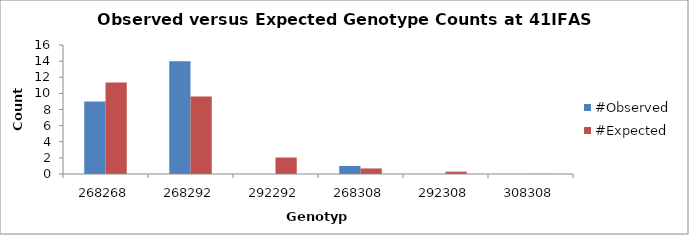
| Category | #Observed | #Expected |
|---|---|---|
| 268268.0 | 9 | 11.344 |
| 268292.0 | 14 | 9.625 |
| 292292.0 | 0 | 2.042 |
| 268308.0 | 1 | 0.688 |
| 292308.0 | 0 | 0.292 |
| 308308.0 | 0 | 0.01 |